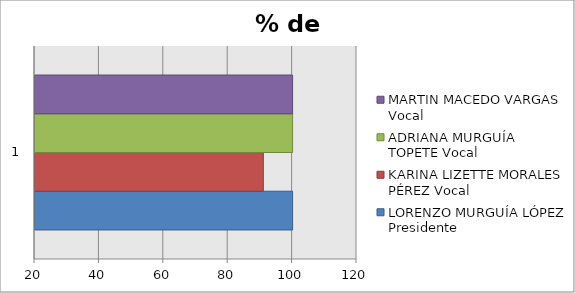
| Category | LORENZO MURGUÍA LÓPEZ Presidente | KARINA LIZETTE MORALES PÉREZ Vocal | ADRIANA MURGUÍA TOPETE Vocal | MARTIN MACEDO VARGAS Vocal |
|---|---|---|---|---|
| 0 | 100 | 90.9 | 100 | 100 |